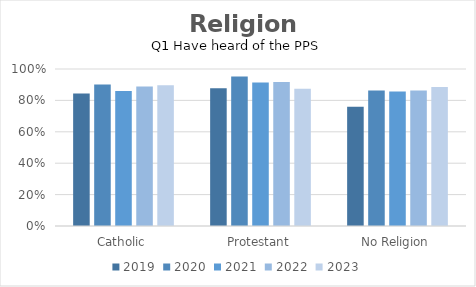
| Category | 2019 | 2020 | 2021 | 2022 | 2023 |
|---|---|---|---|---|---|
| Catholic | 0.844 | 0.901 | 0.86 | 0.888 | 0.896 |
| Protestant | 0.877 | 0.952 | 0.913 | 0.917 | 0.875 |
| No Religion | 0.759 | 0.863 | 0.856 | 0.863 | 0.886 |